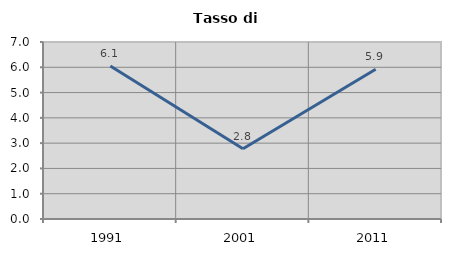
| Category | Tasso di disoccupazione   |
|---|---|
| 1991.0 | 6.051 |
| 2001.0 | 2.775 |
| 2011.0 | 5.923 |